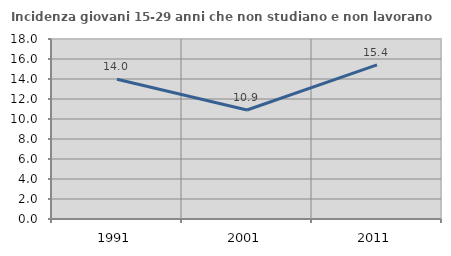
| Category | Incidenza giovani 15-29 anni che non studiano e non lavorano  |
|---|---|
| 1991.0 | 13.978 |
| 2001.0 | 10.902 |
| 2011.0 | 15.415 |